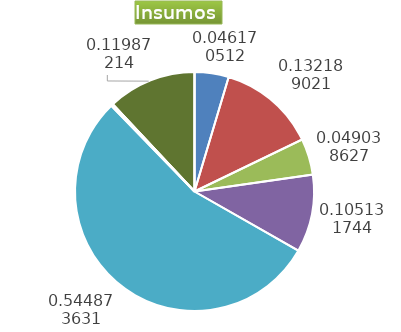
| Category | Series 0 |
|---|---|
| Control arvenses | 523542 |
| Control fitosanitario | 1498933 |
| Cosecha y beneficio | 556064.456 |
| Fertilización | 1192122 |
| Instalación | 6178493.957 |
| Otros | 30892 |
| Podas | 0 |
| Riego | 0 |
| Transporte | 1359268 |
| Tutorado | 0 |